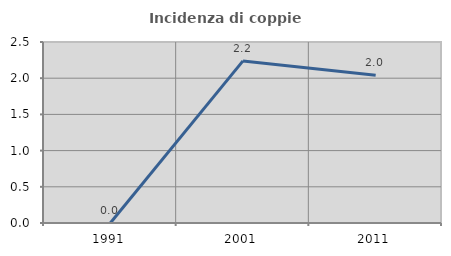
| Category | Incidenza di coppie miste |
|---|---|
| 1991.0 | 0 |
| 2001.0 | 2.239 |
| 2011.0 | 2.041 |